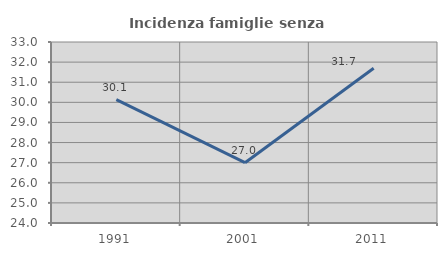
| Category | Incidenza famiglie senza nuclei |
|---|---|
| 1991.0 | 30.139 |
| 2001.0 | 27 |
| 2011.0 | 31.692 |